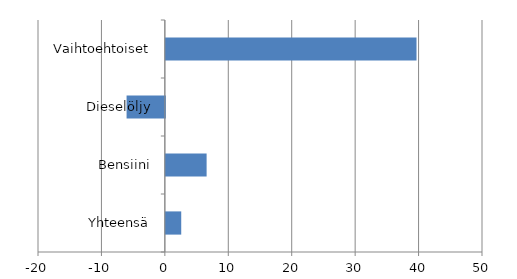
| Category | Series 0 |
|---|---|
| Yhteensä | 2.424 |
| Bensiini | 6.426 |
| Dieselöljy | -6.036 |
| Vaihtoehtoiset | 39.519 |